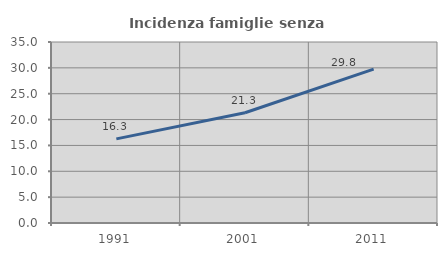
| Category | Incidenza famiglie senza nuclei |
|---|---|
| 1991.0 | 16.263 |
| 2001.0 | 21.313 |
| 2011.0 | 29.769 |